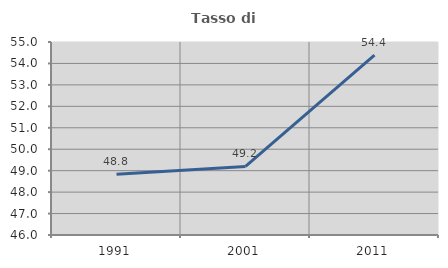
| Category | Tasso di occupazione   |
|---|---|
| 1991.0 | 48.831 |
| 2001.0 | 49.196 |
| 2011.0 | 54.389 |